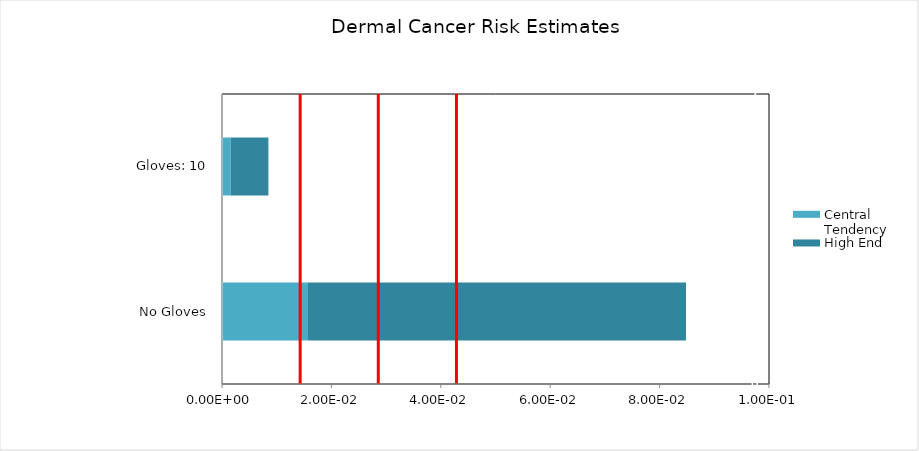
| Category | Central Tendency | High End |
|---|---|---|
| No Gloves | 0.016 | 0.069 |
| Gloves: 10 | 0.002 | 0.007 |